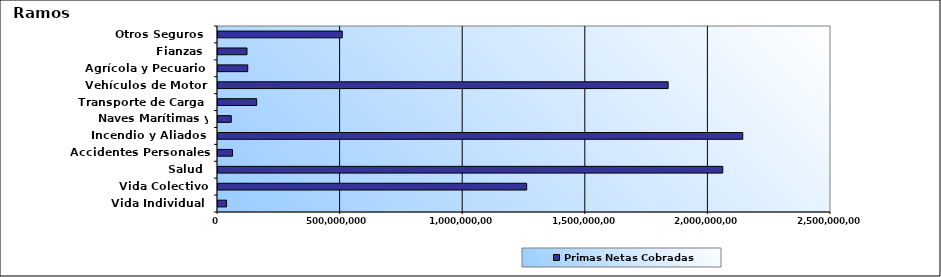
| Category | Primas Netas Cobradas |
|---|---|
| Vida Individual  | 34908109.46 |
| Vida Colectivo | 1258869280.22 |
| Salud  | 2058586025.5 |
| Accidentes Personales | 59088397.52 |
| Incendio y Aliados  | 2140195277.87 |
| Naves Marítimas y Aéreas  | 54096328.65 |
| Transporte de Carga  | 157735415 |
| Vehículos de Motor  | 1835868877.18 |
| Agrícola y Pecuario  | 121288450.16 |
| Fianzas  | 118162702.89 |
| Otros Seguros  | 506808819.82 |